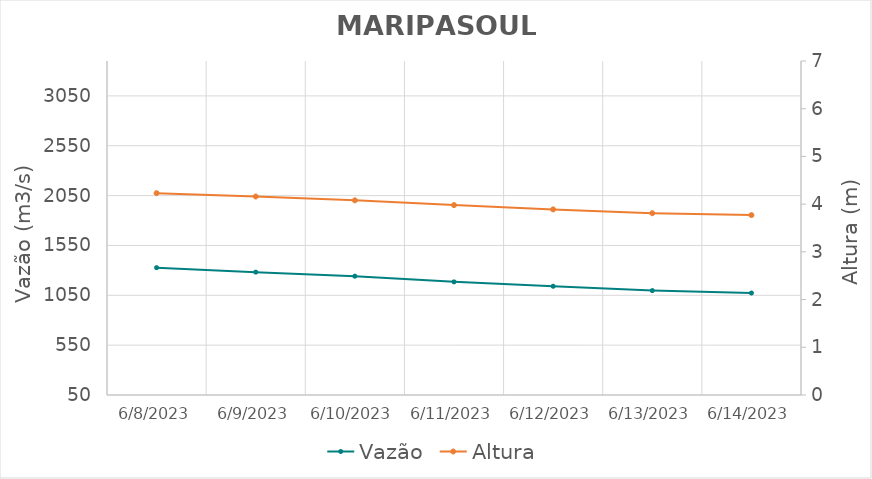
| Category | Vazão |
|---|---|
| 4/26/22 | 2674.62 |
| 4/25/22 | 2596.45 |
| 4/24/22 | 2479.48 |
| 4/23/22 | 2375.34 |
| 4/22/22 | 2270.87 |
| 4/21/22 | 2161.79 |
| 4/20/22 | 2150.66 |